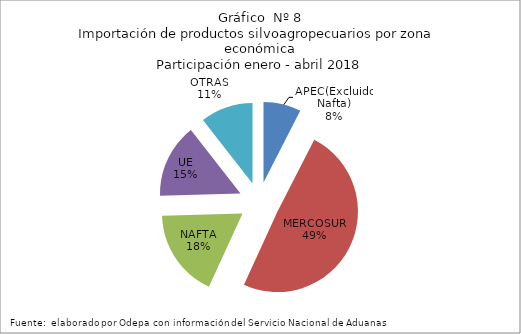
| Category | Series 0 |
|---|---|
| APEC(Excluido Nafta) | 156610.364 |
| MERCOSUR | 1023627.316 |
| NAFTA | 367988.287 |
| UE | 308791.492 |
| OTRAS | 219303.541 |